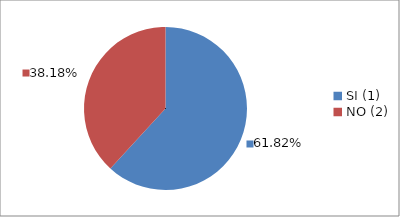
| Category | Series 0 |
|---|---|
| SI (1) | 0.618 |
| NO (2) | 0.382 |